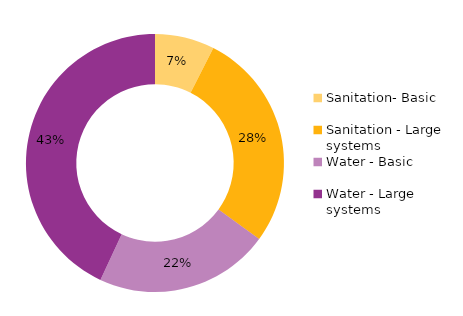
| Category | 2013% |
|---|---|
| Sanitation- Basic | 0.075 |
| Sanitation - Large systems | 0.276 |
| Water - Basic | 0.219 |
| Water - Large systems | 0.43 |